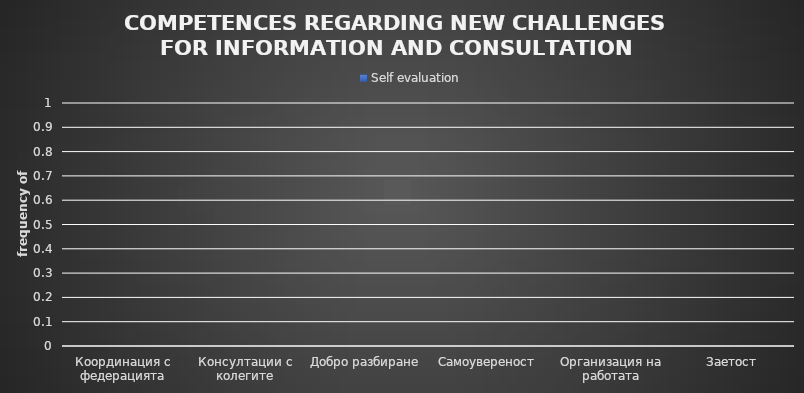
| Category | Self evaluation |
|---|---|
| Координация с федерацията | 0 |
| Консултации с колегите | 0 |
| Добро разбиране | 0 |
| Самоувереност | 0 |
| Организация на работата | 0 |
| Заетост | 0 |